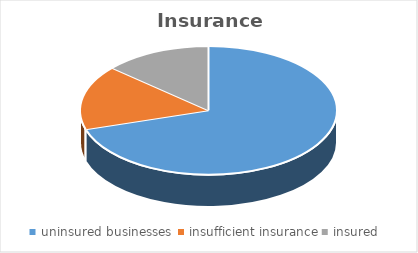
| Category | Series 0 |
|---|---|
| uninsured businesses  | 26 |
| insufficient insurance | 6 |
| insured  | 5 |